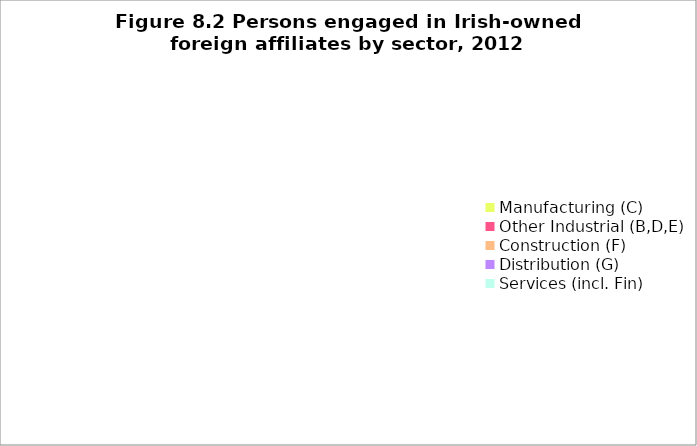
| Category | Series 0 |
|---|---|
| Manufacturing (C) | 0 |
| Other Industrial (B,D,E) | 0 |
| Construction (F) | 0 |
| Distribution (G) | 0 |
| Services (incl. Fin) | 0 |